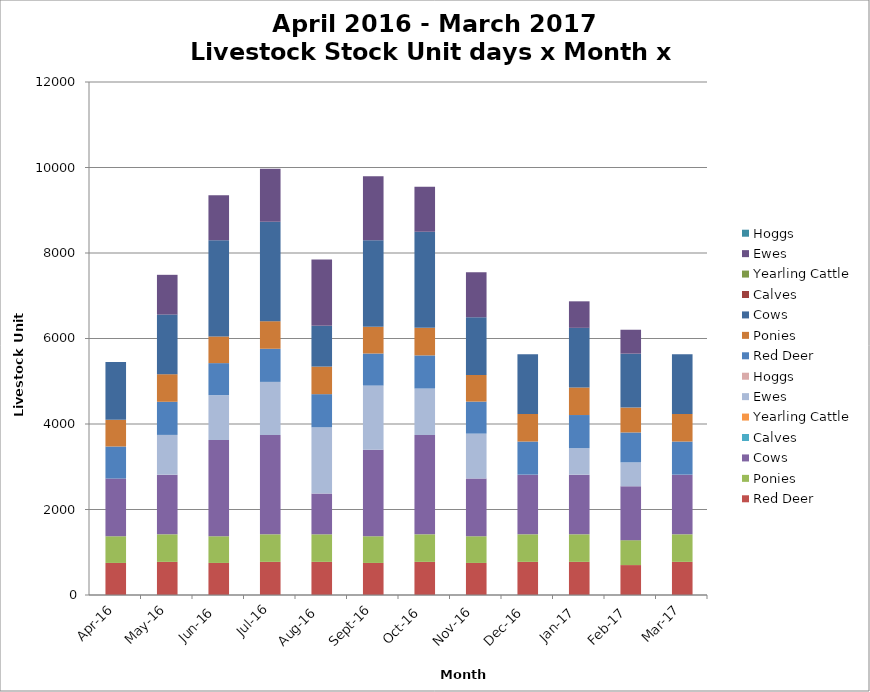
| Category | Red Deer | Ponies | Cows | Calves | Yearling Cattle | Ewes | Hoggs |
|---|---|---|---|---|---|---|---|
| 2016-04-01 |  |  |  |  |  |  |  |
| 2016-05-01 |  |  |  |  |  |  |  |
| 2016-06-01 |  |  |  |  |  |  |  |
| 2016-07-01 |  |  |  |  |  |  |  |
| 2016-08-01 |  |  |  |  |  |  |  |
| 2016-09-01 |  |  |  |  |  |  |  |
| 2016-10-01 |  |  |  |  |  |  |  |
| 2016-11-01 |  |  |  |  |  |  |  |
| 2016-12-01 |  |  |  |  |  |  |  |
| 2017-01-01 |  |  |  |  |  |  |  |
| 2017-02-01 |  |  |  |  |  |  |  |
| 2017-03-01 |  |  |  |  |  |  |  |